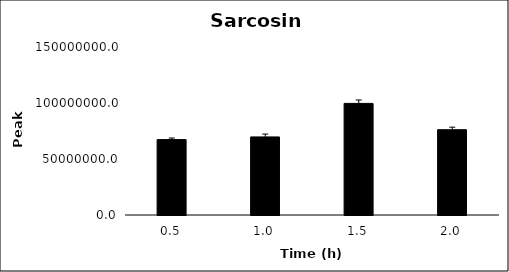
| Category | Series 0 |
|---|---|
| 0.5 | 67316241.667 |
| 1.0 | 69716748.333 |
| 1.5 | 99641684 |
| 2.0 | 76145811.333 |